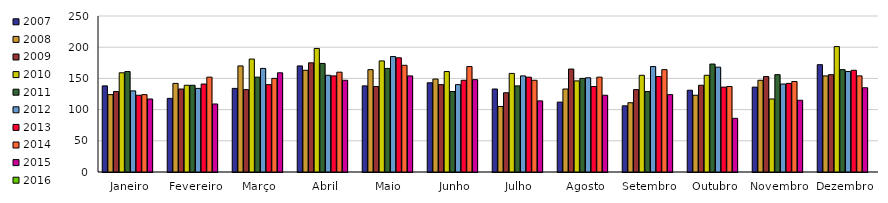
| Category | 2007 | 2008 | 2009 | 2010 | 2011 | 2012 | 2013 | 2014 | 2015 | 2016 |
|---|---|---|---|---|---|---|---|---|---|---|
| Janeiro | 138 | 124 | 129 | 159 | 161 | 130 | 123 | 124 | 117 |  |
| Fevereiro | 118 | 142 | 133 | 139 | 139 | 134 | 141 | 152 | 109 |  |
| Março | 134 | 170 | 132 | 181 | 152 | 166 | 140 | 150 | 159 |  |
| Abril | 170 | 163 | 175 | 198 | 174 | 155 | 154 | 160 | 147 |  |
| Maio | 138 | 164 | 137 | 178 | 166 | 185 | 183 | 171 | 154 |  |
| Junho | 143 | 149 | 140 | 161 | 129 | 140 | 147 | 169 | 148 |  |
| Julho | 133 | 105 | 127 | 158 | 138 | 154 | 152 | 147 | 114 |  |
| Agosto | 112 | 133 | 165 | 146 | 150 | 151 | 137 | 152 | 123 |  |
| Setembro | 106 | 111 | 132 | 155 | 129 | 169 | 153 | 164 | 124 |  |
| Outubro | 131 | 123 | 139 | 155 | 173 | 168 | 136 | 137 | 86 |  |
| Novembro | 136 | 147 | 153 | 117 | 156 | 141 | 142 | 145 | 115 |  |
| Dezembro | 172 | 154 | 156 | 201 | 164 | 161 | 163 | 154 | 135 |  |